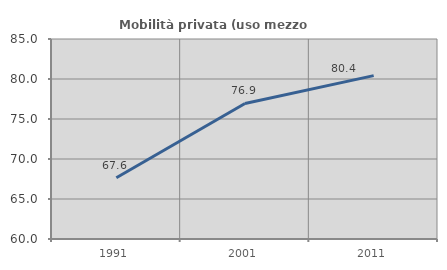
| Category | Mobilità privata (uso mezzo privato) |
|---|---|
| 1991.0 | 67.648 |
| 2001.0 | 76.946 |
| 2011.0 | 80.424 |